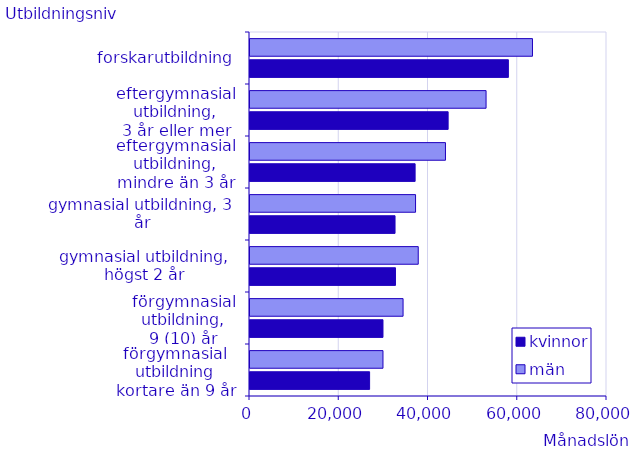
| Category | kvinnor | män |
|---|---|---|
| förgymnasial utbildning
kortare än 9 år | 26800 | 29800 |
| förgymnasial utbildning,
9 (10) år | 29800 | 34300 |
| gymnasial utbildning,
högst 2 år | 32600 | 37700 |
| gymnasial utbildning, 3 år | 32500 | 37100 |
| eftergymnasial utbildning,
mindre än 3 år | 37000 | 43800 |
| eftergymnasial utbildning,
3 år eller mer | 44400 | 52900 |
| forskarutbildning | 57900 | 63300 |